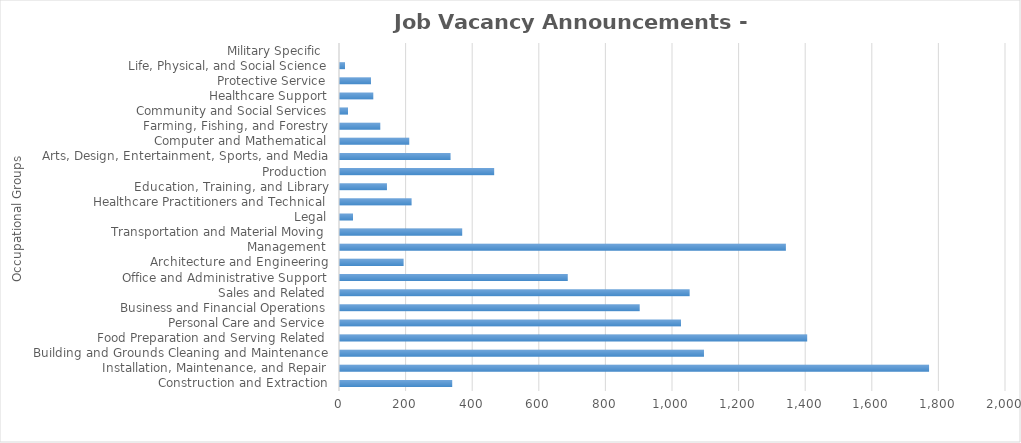
| Category | Total JVAs |
|---|---|
| Construction and Extraction | 337 |
| Installation, Maintenance, and Repair | 1769 |
| Building and Grounds Cleaning and Maintenance | 1093 |
| Food Preparation and Serving Related | 1403 |
| Personal Care and Service | 1024 |
| Business and Financial Operations | 900 |
| Sales and Related | 1050 |
| Office and Administrative Support | 684 |
| Architecture and Engineering | 191 |
| Management | 1339 |
| Transportation and Material Moving | 367 |
| Legal | 39 |
| Healthcare Practitioners and Technical | 215 |
| Education, Training, and Library | 141 |
| Production | 463 |
| Arts, Design, Entertainment, Sports, and Media | 332 |
| Computer and Mathematical | 208 |
| Farming, Fishing, and Forestry | 121 |
| Community and Social Services | 24 |
| Healthcare Support | 100 |
| Protective Service | 93 |
| Life, Physical, and Social Science | 15 |
| Military Specific  | 0 |